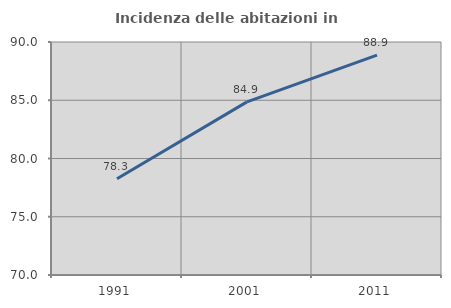
| Category | Incidenza delle abitazioni in proprietà  |
|---|---|
| 1991.0 | 78.261 |
| 2001.0 | 84.859 |
| 2011.0 | 88.878 |